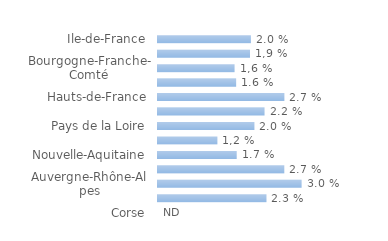
| Category | Series 0 |
|---|---|
| Ile-de-France | 0.02 |
| Centre-Val de Loire | 0.019 |
| Bourgogne-Franche-Comté | 0.016 |
| Normandie | 0.016 |
| Hauts-de-France | 0.027 |
| Grand Est | 0.022 |
| Pays de la Loire | 0.02 |
| Bretagne | 0.012 |
| Nouvelle-Aquitaine | 0.017 |
| Occitanie | 0.027 |
| Auvergne-Rhône-Alpes | 0.03 |
| Provence-Alpes-Côte d'Azur | 0.023 |
| Corse | 0 |